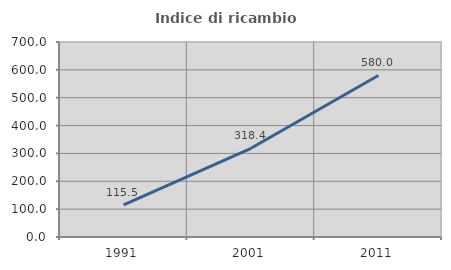
| Category | Indice di ricambio occupazionale  |
|---|---|
| 1991.0 | 115.504 |
| 2001.0 | 318.367 |
| 2011.0 | 580 |